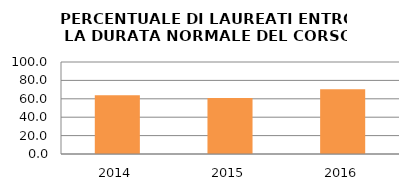
| Category | 2014 2015 2016 |
|---|---|
| 2014.0 | 63.81 |
| 2015.0 | 60.952 |
| 2016.0 | 70.253 |